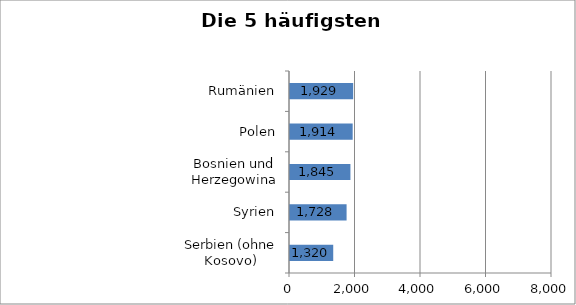
| Category | Series 0 |
|---|---|
| Serbien (ohne Kosovo) | 1320 |
| Syrien | 1728 |
| Bosnien und Herzegowina | 1845 |
| Polen | 1914 |
| Rumänien | 1929 |